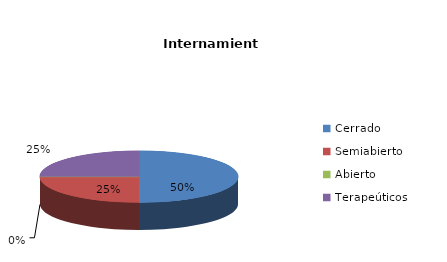
| Category | Series 0 |
|---|---|
| Cerrado | 2 |
| Semiabierto | 1 |
| Abierto | 0 |
| Terapeúticos | 1 |